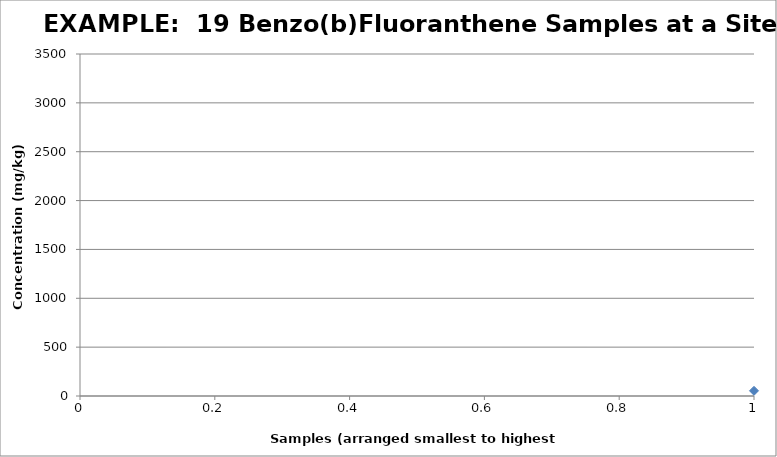
| Category | Series 0 |
|---|---|
| 0 | 53 |
| 1 | 62 |
| 2 | 67 |
| 3 | 71 |
| 4 | 75 |
| 5 | 80 |
| 6 | 82 |
| 7 | 120 |
| 8 | 150 |
| 9 | 150 |
| 10 | 160 |
| 11 | 170 |
| 12 | 170 |
| 13 | 190 |
| 14 | 230 |
| 15 | 470 |
| 16 | 800 |
| 17 | 890 |
| 18 | 3100 |